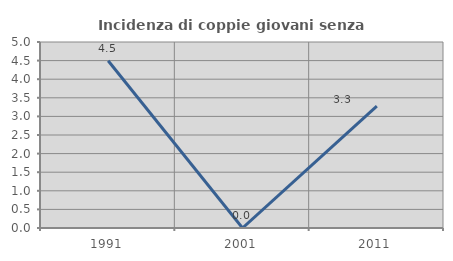
| Category | Incidenza di coppie giovani senza figli |
|---|---|
| 1991.0 | 4.494 |
| 2001.0 | 0 |
| 2011.0 | 3.279 |